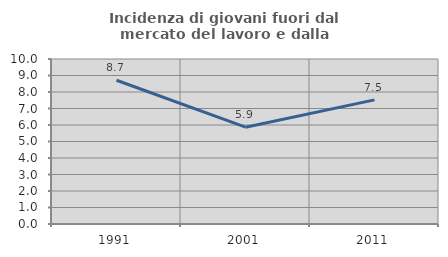
| Category | Incidenza di giovani fuori dal mercato del lavoro e dalla formazione  |
|---|---|
| 1991.0 | 8.711 |
| 2001.0 | 5.866 |
| 2011.0 | 7.522 |